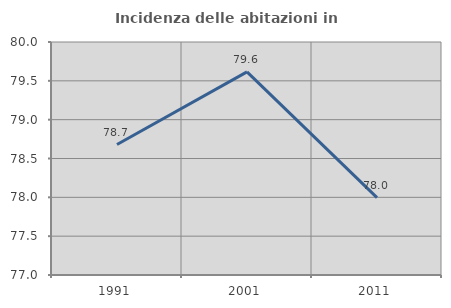
| Category | Incidenza delle abitazioni in proprietà  |
|---|---|
| 1991.0 | 78.68 |
| 2001.0 | 79.615 |
| 2011.0 | 77.997 |